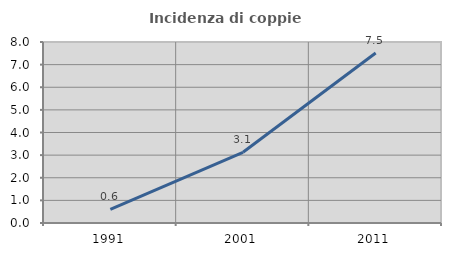
| Category | Incidenza di coppie miste |
|---|---|
| 1991.0 | 0.599 |
| 2001.0 | 3.125 |
| 2011.0 | 7.514 |